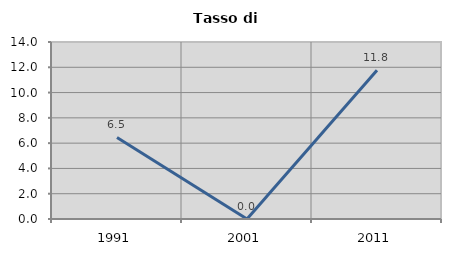
| Category | Tasso di disoccupazione   |
|---|---|
| 1991.0 | 6.452 |
| 2001.0 | 0 |
| 2011.0 | 11.765 |